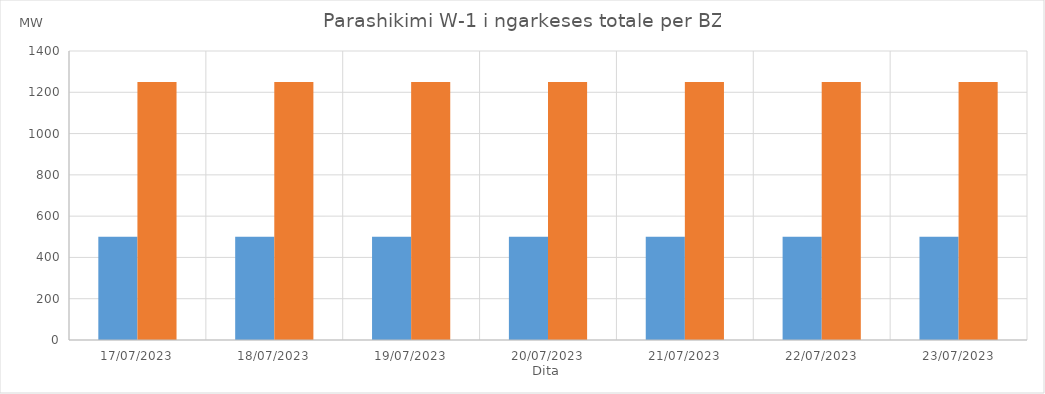
| Category | Min (MW) | Max (MW) |
|---|---|---|
| 17/07/2023 | 500 | 1250 |
| 18/07/2023 | 500 | 1250 |
| 19/07/2023 | 500 | 1250 |
| 20/07/2023 | 500 | 1250 |
| 21/07/2023 | 500 | 1250 |
| 22/07/2023 | 500 | 1250 |
| 23/07/2023 | 500 | 1250 |